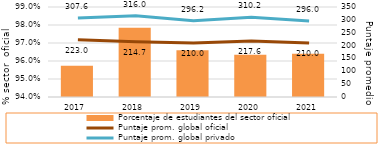
| Category | Porcentaje de estudiantes del sector oficial |
|---|---|
| 2017.0 | 0.957 |
| 2018.0 | 0.979 |
| 2019.0 | 0.966 |
| 2020.0 | 0.963 |
| 2021.0 | 0.964 |